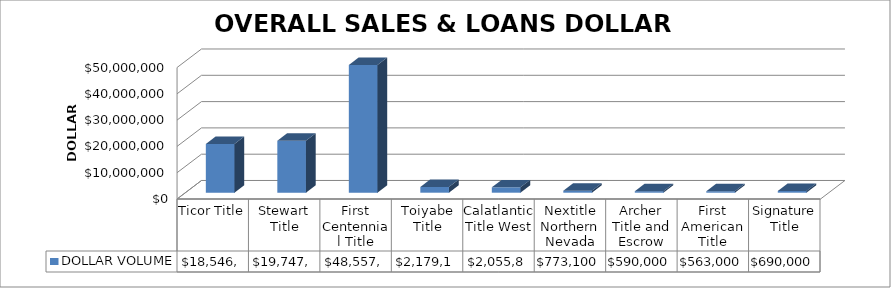
| Category | DOLLAR VOLUME |
|---|---|
| Ticor Title | 18546090 |
| Stewart Title | 19747128 |
| First Centennial Title | 48557780 |
| Toiyabe Title | 2179100 |
| Calatlantic Title West | 2055829 |
| Nextitle Northern Nevada | 773100 |
| Archer Title and Escrow | 590000 |
| First American Title | 563000 |
| Signature Title | 690000 |